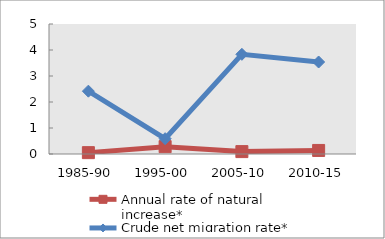
| Category | Annual rate of natural increase* | Crude net migration rate* |
|---|---|---|
| 1985-90 | 0.052 | 2.417 |
| 1995-00 | 0.283 | 0.589 |
| 2005-10 | 0.092 | 3.834 |
| 2010-15 | 0.137 | 3.538 |